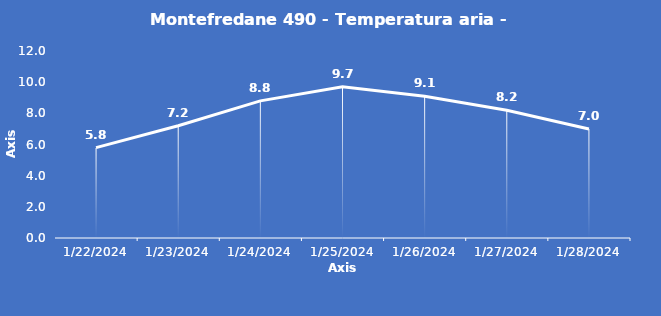
| Category | Montefredane 490 - Temperatura aria - Grezzo (°C) |
|---|---|
| 1/22/24 | 5.8 |
| 1/23/24 | 7.2 |
| 1/24/24 | 8.8 |
| 1/25/24 | 9.7 |
| 1/26/24 | 9.1 |
| 1/27/24 | 8.2 |
| 1/28/24 | 7 |